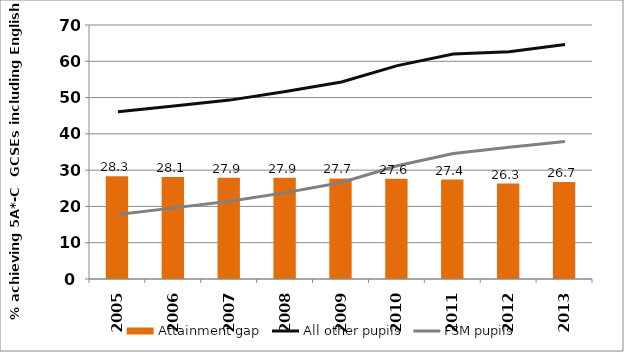
| Category | Attainment gap |
|---|---|
| 0 | 28.3 |
| 1 | 28.1 |
| 2 | 27.9 |
| 3 | 27.9 |
| 4 | 27.7 |
| 5 | 27.6 |
| 6 | 27.4 |
| 7 | 26.3 |
| 8 | 26.7 |